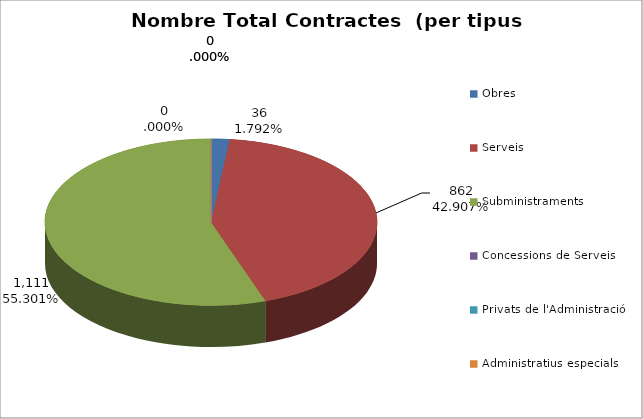
| Category | Nombre Total Contractes |
|---|---|
| Obres | 36 |
| Serveis | 862 |
| Subministraments | 1111 |
| Concessions de Serveis | 0 |
| Privats de l'Administració | 0 |
| Administratius especials | 0 |